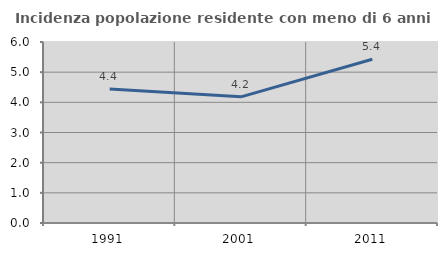
| Category | Incidenza popolazione residente con meno di 6 anni |
|---|---|
| 1991.0 | 4.439 |
| 2001.0 | 4.183 |
| 2011.0 | 5.427 |